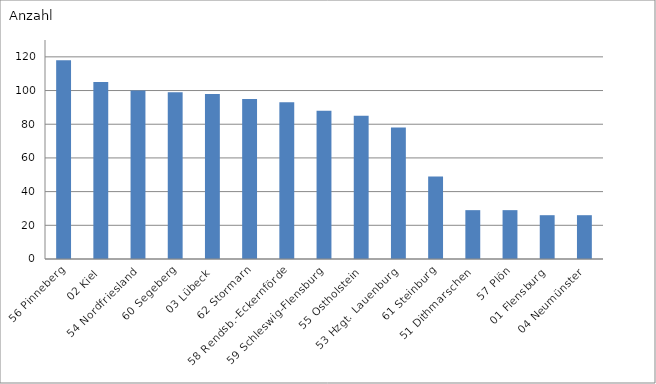
| Category | 56 Pinneberg |
|---|---|
| 56 Pinneberg | 118 |
| 02 Kiel | 105 |
| 54 Nordfriesland | 100 |
| 60 Segeberg | 99 |
| 03 Lübeck | 98 |
| 62 Stormarn | 95 |
| 58 Rendsb.-Eckernförde | 93 |
| 59 Schleswig-Flensburg | 88 |
| 55 Ostholstein | 85 |
| 53 Hzgt. Lauenburg | 78 |
| 61 Steinburg | 49 |
| 51 Dithmarschen | 29 |
| 57 Plön | 29 |
| 01 Flensburg | 26 |
| 04 Neumünster | 26 |